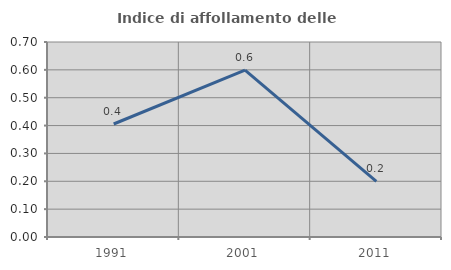
| Category | Indice di affollamento delle abitazioni  |
|---|---|
| 1991.0 | 0.406 |
| 2001.0 | 0.599 |
| 2011.0 | 0.2 |